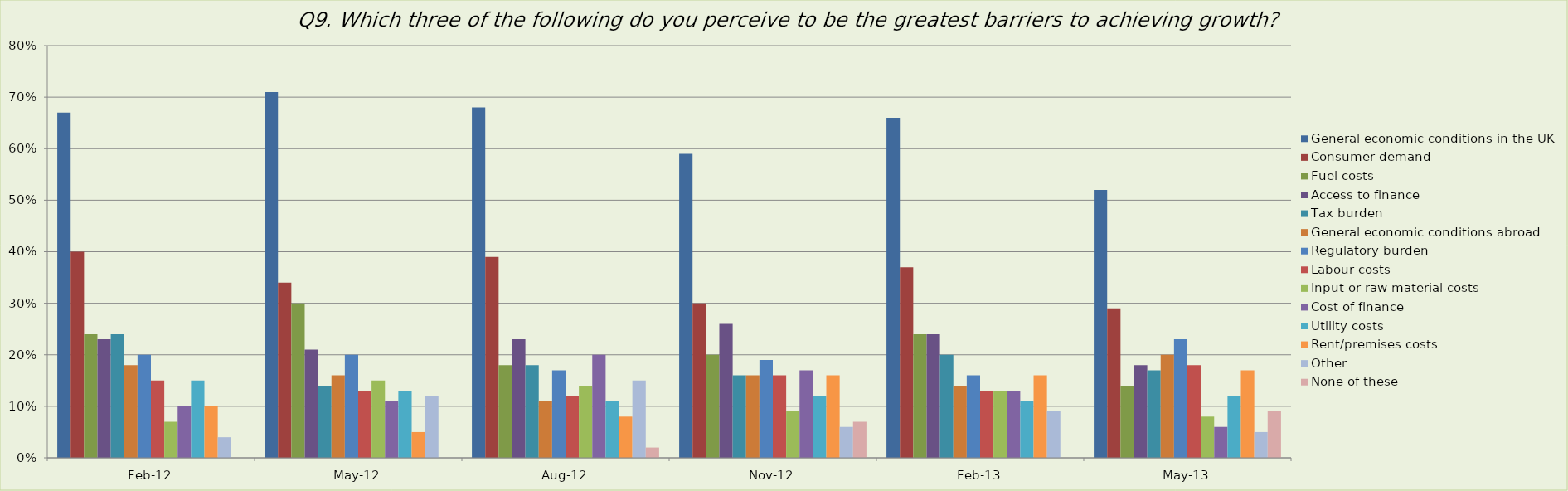
| Category | General economic conditions in the UK  | Consumer demand | Fuel costs | Access to finance | Tax burden | General economic conditions abroad  | Regulatory burden | Labour costs | Input or raw material costs | Cost of finance  | Utility costs | Rent/premises costs | Other | None of these |
|---|---|---|---|---|---|---|---|---|---|---|---|---|---|---|
| 2012-02-01 | 0.67 | 0.4 | 0.24 | 0.23 | 0.24 | 0.18 | 0.2 | 0.15 | 0.07 | 0.1 | 0.15 | 0.1 | 0.04 | 0 |
| 2012-05-01 | 0.71 | 0.34 | 0.3 | 0.21 | 0.14 | 0.16 | 0.2 | 0.13 | 0.15 | 0.11 | 0.13 | 0.05 | 0.12 | 0 |
| 2012-08-01 | 0.68 | 0.39 | 0.18 | 0.23 | 0.18 | 0.11 | 0.17 | 0.12 | 0.14 | 0.2 | 0.11 | 0.08 | 0.15 | 0.02 |
| 2012-11-01 | 0.59 | 0.3 | 0.2 | 0.26 | 0.16 | 0.16 | 0.19 | 0.16 | 0.09 | 0.17 | 0.12 | 0.16 | 0.06 | 0.07 |
| 2013-02-01 | 0.66 | 0.37 | 0.24 | 0.24 | 0.2 | 0.14 | 0.16 | 0.13 | 0.13 | 0.13 | 0.11 | 0.16 | 0.09 | 0 |
| 2013-05-01 | 0.52 | 0.29 | 0.14 | 0.18 | 0.17 | 0.2 | 0.23 | 0.18 | 0.08 | 0.06 | 0.12 | 0.17 | 0.05 | 0.09 |